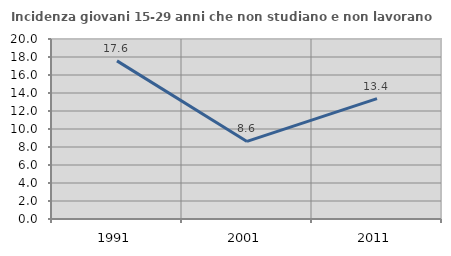
| Category | Incidenza giovani 15-29 anni che non studiano e non lavorano  |
|---|---|
| 1991.0 | 17.568 |
| 2001.0 | 8.617 |
| 2011.0 | 13.379 |